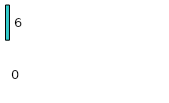
| Category | Series 0 | Series 1 |
|---|---|---|
| 0 | 0 | 6 |